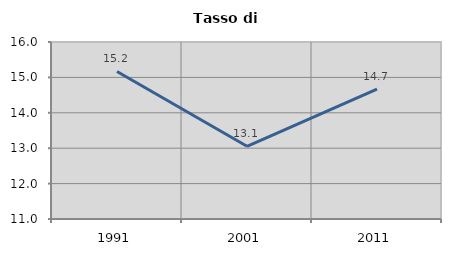
| Category | Tasso di disoccupazione   |
|---|---|
| 1991.0 | 15.167 |
| 2001.0 | 13.054 |
| 2011.0 | 14.667 |